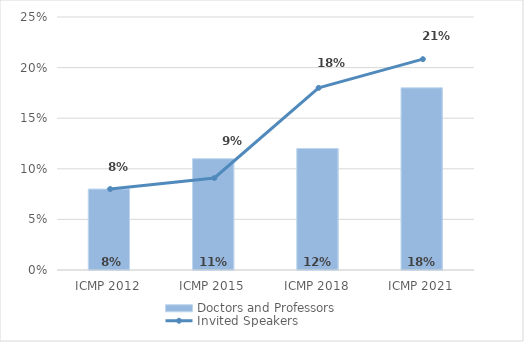
| Category | Doctors and Professors |
|---|---|
| ICMP 2012 | 0.08 |
| ICMP 2015 | 0.11 |
| ICMP 2018 | 0.12 |
| ICMP 2021 | 0.18 |